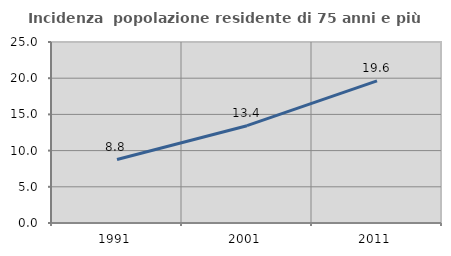
| Category | Incidenza  popolazione residente di 75 anni e più |
|---|---|
| 1991.0 | 8.767 |
| 2001.0 | 13.439 |
| 2011.0 | 19.634 |